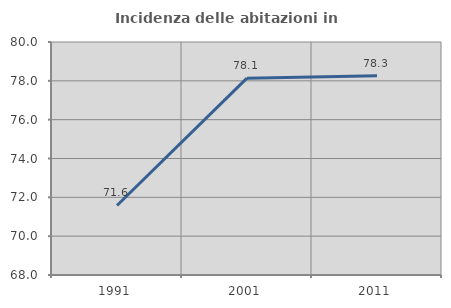
| Category | Incidenza delle abitazioni in proprietà  |
|---|---|
| 1991.0 | 71.581 |
| 2001.0 | 78.136 |
| 2011.0 | 78.257 |